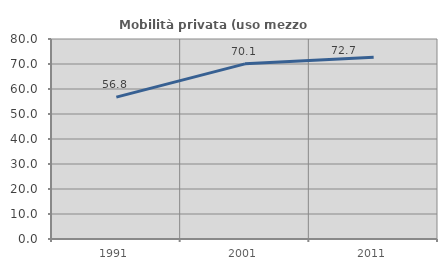
| Category | Mobilità privata (uso mezzo privato) |
|---|---|
| 1991.0 | 56.757 |
| 2001.0 | 70.052 |
| 2011.0 | 72.664 |